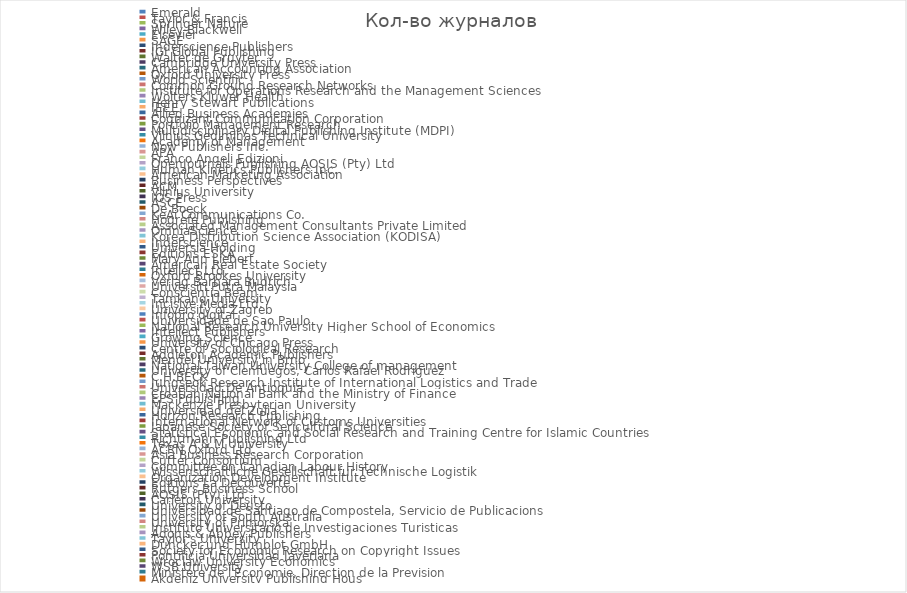
| Category | Кол-во журналов |
|---|---|
| Emerald | 183 |
| Taylor & Francis | 167 |
| Springer Nature | 107 |
| Wiley-Blackwell | 103 |
| Elsevier | 102 |
| SAGE | 93 |
| Inderscience Publishers | 92 |
| IGI Global Publishing | 22 |
| Walter de Gruyter | 22 |
| Cambridge University Press | 14 |
| American Accounting Association | 14 |
| Oxford University Press | 11 |
| World Scientific | 11 |
| Common Ground Research Networks | 7 |
| Institute for Operations Research and the Management Sciences | 7 |
| Wolters Kluwer Health | 6 |
| Henry Stewart Publications | 6 |
| IEEE | 5 |
| Allied Business Academies | 5 |
| Cognizant Communication Corporation | 5 |
| Portfolio Management Research | 4 |
| Multidisciplinary Digital Publishing Institute (MDPI) | 4 |
| Vilnius Gediminas Technical University | 4 |
| Academy of Management | 4 |
| Now Publishers Inc. | 4 |
| APA | 3 |
| Franco Angeli Edizioni | 3 |
| OpenJournals Publishing AOSIS (Pty) Ltd | 3 |
| Human Kinetics Publishers Inc. | 3 |
| American Marketing Association | 3 |
| Business Perspectives | 3 |
| ACM | 3 |
| Vilnius University | 3 |
| IOS Press | 3 |
| ASCE | 3 |
| De Boeck | 3 |
| KeAi Communications Co. | 3 |
| Hogrefe Publishing | 2 |
| Associated Management Consultants Private Limited | 2 |
| OmniaScience | 2 |
| Korea Distribution Science Association (KODISA) | 2 |
| Inderscience | 2 |
| Universia Holding | 2 |
| Editions ESKA | 2 |
| Mary Ann Liebert | 2 |
| American Real Estate Society | 2 |
| Intellect Ltd. | 2 |
| Oxford Brookes University | 2 |
| Verlag Barbara Budrich | 2 |
| Universiti Putra Malaysia | 2 |
| Conscientia Beam | 2 |
| Tamkang University | 2 |
| Incisive Media Ltd. | 2 |
| University of Zagreb | 2 |
| Infopro digital | 2 |
| Universidade de Sao Paulo | 2 |
| National Research University Higher School of Economics | 2 |
| Intellect Publishers | 2 |
| Growing Science | 2 |
| University of Chicago Press | 2 |
| Centre of Sociological Research | 2 |
| Addleton Academic Publishers | 2 |
| Mendel University in Brno | 1 |
| National Taiwan University College of management | 1 |
| University of Cienfuegos, Carlos Rafael Rodriguez | 1 |
| C.H.BECK | 1 |
| Jungseok Research Institute of International Logistics and Trade | 1 |
| Universidad De Antioquia | 1 |
| Croatian National Bank and the Ministry of Finance | 1 |
| EPS Publishing | 1 |
| Mackenzie Presbyterian University | 1 |
| Universidad del Zulia | 1 |
| Horizon Research Publishing | 1 |
| International Network of Customs Universities | 1 |
| Japanese Society of Sericultural Science | 1 |
| Statistical Economic and Social Research and Training Centre for Islamic Countries | 1 |
| Richtmann Publishing Ltd | 1 |
| Texas A & M University | 1 |
| ACRN Oxford Ltd. | 1 |
| Asia Business Research Corporation | 1 |
| Cutter Consortium | 1 |
| Committee on Canadian Labour History | 1 |
| Wissenschaftliche Gesellschaft fur Technische Logistik | 1 |
| Organization Development Institute | 1 |
| Editions La Decouverte | 1 |
| Rutgers Business School | 1 |
| AOSIS (Pty) Ltd | 1 |
| Carleton University | 1 |
| University of Deusto | 1 |
| Universidad de Santiago de Compostela, Servicio de Publicacions | 1 |
| University of South Australia | 1 |
| University of Primorska | 1 |
| Instituto Universitario de Investigaciones Turisticas | 1 |
| Adonis & Abbey Publishers | 1 |
| Taylor's University | 1 |
| Duncker und Humblot GmbH | 1 |
| Society for Economic Research on Copyright Issues | 1 |
| Pontificia Universidad Javeriana | 1 |
| Wroclaw University Economics | 1 |
| WSB University | 1 |
| Ministere de l'Economie, Direction de la Prevision | 1 |
| Akdeniz University Publishing Hous | 1 |
| Chulalognkorn University | 1 |
| US. Bureau of Labor Statistics | 1 |
| Asociatia de Psihologie Industriala si Organizationala | 1 |
| Australasian Tax Teachers' Association | 1 |
| University of Pardubice | 1 |
| The Association of Private Enterprise Education | 1 |
| Escuela Universitaria de Turismo, Universidad de Murcia | 1 |
| Restaurant Business | 1 |
| Middle East Forum | 1 |
| CERN Publishing | 1 |
| Academy of Taiwan Information Systems Research | 1 |
| Universidade Federal Rural de Pernambuco | 1 |
| FUCAPE Business School | 1 |
| UP Media Group, Inc. | 1 |
| Australian School of Business, University of New South Wales | 1 |
| INFORMS Institute for Operations Research and the Management Sciences | 1 |
| Department of Textile and Apparel, Technology and Management | 1 |
| Penerbit Universiti Teknikal Malaysia Melaka | 1 |
| Korean Society for Railway | 1 |
| Singapore University Press | 1 |
| Society for Alliance, Fidelity and Advancement | 1 |
| University of Tehran | 1 |
| Lavoisier | 1 |
| John Benjamins Publishing Company | 1 |
| Ministere du Travail et de la Participation | 1 |
| Research Institute for Man-Made Fibres | 1 |
| Canadian Network for Innovation in Education | 1 |
| Francophone Association of Accounting | 1 |
| Islamic Azad University | 1 |
| Metropolitan Publishing | 1 |
| Universidad de Oviedo | 1 |
| Asian Exercise and Sport Science Association | 1 |
| Textile Rental Services Association of America | 1 |
| Social Sciences Research Society | 1 |
| Masaryk University Faculty of Sports Studies | 1 |
| Universidad Icesi | 1 |
| Textile Association (India) | 1 |
| California State University Press | 1 |
| Japan Research Association for Textile End-User | 1 |
| University of Saskatchewan, Department of Educational Administration, College of Education | 1 |
| Advanstar Communications Inc. | 1 |
| Universidade Federal de Santa Catarina | 1 |
| Graziadio School of Business and Management-Pepperdine University | 1 |
| Universidad Nacional de La Plata | 1 |
| Gito Verlag | 1 |
| Food Distribution Research Society | 1 |
| River Publishers | 1 |
| Nihon Keikei Kogakkai | 1 |
| Financial University under The Government of Russian Federation | 1 |
| Duke University Press | 1 |
| National Taipei University of Technology | 1 |
| North University of China | 1 |
| School of Management Sciences | 1 |
| GDMB Informationsgesellschaft mbH | 1 |
| Warsaw University | 1 |
| Philosophy Documentation Center | 1 |
| Herald Academic Ltd | 1 |
| Indian Institute of Finance | 1 |
| The Society of Systematic Innovation | 1 |
| Global Social Science Institute | 1 |
| Journal of Australian Taxation Pty Ltd | 1 |
| University of Aveiro | 1 |
| Institute of Economic Sciences | 1 |
| Korean Accounting Association | 1 |
| Polska Akademia Nauk | 1 |
| SCMS Group of Educational Institutions | 1 |
| Textiles Intelligence Ltd. | 1 |
| Virtus Interpress | 1 |
| Presses Universitaires de Grenoble | 1 |
| Universitat de Barcelona, Facultad de Economia y Empresa | 1 |
| Universidad Politecnica de Valencia | 1 |
| Journal of Accounting Review | 1 |
| Association of Guilds of Weavers Spinners & Dyers | 1 |
| Ewha Womans University Graduate School of International Studies | 1 |
| Verlag Neue Wirtschafts-Briete GmbH & Co. | 1 |
| Sheshunoff Information Services Inc. | 1 |
| Engineering Project Organization Society (EPOS) | 1 |
| Thomson Reuters | 1 |
| ADAPT University Press | 1 |
| GEA College - Faculty of Entrepreneurship | 1 |
| Pablo de Olavide University | 1 |
| Wydawnictwo Naukowe Uniwersytetu Szczecinskiego | 1 |
| University of Kassel | 1 |
| Assumption University | 1 |
| Universidade Federal De Goias (UFG) | 1 |
| Prague University of Economics and Business | 1 |
| Information Institute | 1 |
| VGTU: Vilniaus Gedimino technikos universitetas | 1 |
| Wroclaw University of Science and Technology | 1 |
| Edinburgh University Press | 1 |
| Documentation Francaise | 1 |
| F. Cass | 1 |
| COMADEM International | 1 |
| Massey University | 1 |
| Publishing India Group | 1 |
| Iran University of Science and Technology | 1 |
| National Academy of Sciences of Ukraine | 1 |
| IAE School of Management Montpellier University | 1 |
| eum - Edizioni Universita di Macerata | 1 |
| Liverpool University Press | 1 |
| Taiwan Association of Engineering and Technology Innovation | 1 |
| Futuribles International | 1 |
| Boom Lemma uitgevers | 1 |
| Slovenian Academy of Management | 1 |
| Harvard International Relations Council | 1 |
| International Association of Assessing Officers | 1 |
| SRA International | 1 |
| American Society for Quality Control | 1 |
| Universidad de Valladolid | 1 |
| Institute of Agricultural Management | 1 |
| Pro Global Science Association | 1 |
| Universidade Nove de Julho-UNINOVE | 1 |
| Waxmann Verlag GMBH | 1 |
| Editions Classiques Garnier | 1 |
| Publishing House Akademperiodyka | 1 |
| University of Kragujevac - Faculty of Economics | 1 |
| Universidad Nacional de Colombia | 1 |
| Marketing Management Association | 1 |
| De la Salle University | 1 |
| Higher Education Press | 1 |
| Institute for Tourism & Croatian Tourist Board | 1 |
| CENTMA Research | 1 |
| Institute of Economics, The Ural Branch of Russian Academy of Sciences | 1 |
| Cogent OA | 1 |
| Technical University of Kosice | 1 |
| ASERS Publishing House | 1 |
| Faculty of Engineering Universitas Indonesia | 1 |
| N T C Publications Ltd. | 1 |
| International University College | 1 |
| Anadolu University, Faculty of Communication Sciences | 1 |
| Montenegrin Sports Academy | 1 |
| ICE Publishing Ltd. | 1 |
| The Information Resources Management Association (IRMA) | 1 |
| PC Technology Center | 1 |
| Cracow University of Economics | 1 |
| Kaunas University of Technology | 1 |
| Technical University Liberec | 1 |
| Association for Computing Machinery (ACM) | 1 |
| University of Novi Sad | 1 |
| Fitness Information Technology | 1 |
| International Strategic Management Association | 1 |
| SRAC - Societatea Romana Pentru Asigurarea Calitatii | 1 |
| L & H Scientific Publishing, LLC | 1 |
| Sichuan Institute of Piezoelectric and Acoustooptic Technology | 1 |
| International Journal of Mathematical, Engineering and Management Sciences (IJMEMS) | 1 |
| Gadjah Mada University | 1 |
| Regional Science Association of Subotica (Drustvo za Regionalne Nauke) | 1 |
| University of Belgrade | 1 |
| Midwest Public Affairs Conference | 1 |
| Northwestern University School of Law | 1 |
| American Institute of Mathematical Sciences | 1 |
| American Institute of Aeronautics and Astronautics | 1 |
| Federal Reserve Bank of St. Louis | 1 |
| The Technical University of Lodz | 1 |
| Asian Economic and Social Society | 1 |
| Penerbit Universiti Sains Malaysia | 1 |
| Editura Economica | 1 |
| Now Publishers Inc | 1 |
| University of Rijeka, Faculty of Tourism and Hospitality Management, Opatija | 1 |
| University of Novi Sad, Faculty of Technical Sciences | 1 |
| International Food and Agribusiness Management Association | 1 |
| University of Economics and Human Sciences in Warsaw | 1 |
| The Advertising Research Foundation | 1 |
| Czestochowa University of Technology | 1 |
| Middle Tennessee State University | 1 |
| Scika | 1 |
| United Nations Publications | 1 |
| Engage Healthcare Communications, LLC | 1 |
| Massachusetts Institute of Technology | 1 |
| National Cheng Kung University | 1 |
| Production Engineering Institute (PEI), University of Maribor | 1 |
| Instytut Badań Gospodarczych/Institute of Economic Research (Poland) | 1 |
| University of Wisconsin Press | 1 |
| Cornell University Press | 1 |
| George Washington University | 1 |
| European Academy of Management and Business Economics | 1 |
| University of California Press | 1 |
| University of Minnesota | 1 |
| Brookings Institution Press | 1 |
| National Taiwan University of Science and Technology | 1 |
| American Society for Quality | 1 |
| Tongji University Press | 1 |
| FiT Publishing | 1 |
| Polish Academy of Sciences | 1 |
| Tomas Bata University in Zlin | 1 |
| UQ Business School, The University of Queensland | 1 |
| UTS ePress | 1 |
| Rutgers University | 1 |
| Harvard Business School Publishing | 1 |
| University of Wollongong | 1 |
| Dove Medical Press | 1 |
| Hindawi | 1 |
| Colegio Oficial de Psicólogos de Madrid | 1 |
| Societa Italiana di Estimo e Valutazione (SIEV) | 1 |
| Ashwin Anokha Publications and Distributors | 1 |
| Ore & Metals Publishing House | 1 |
| Fakulteta za Organizacijske Vede, Univerza v Mariboru | 1 |
| University of Hong Kong | 1 |
| Association for Investment Management and Research | 1 |
| Academic Conferences and Publishing International | 1 |
| Roskilde University | 1 |
| University of Bahrain | 1 |
| University of Malaya | 1 |
| Dublin Institute of Technology | 1 |
| Premier Publishing | 1 |
| Sanseido Publishing Company, Ltd. | 1 |
| Universidad de Huelva | 1 |
| BMJ Publishing Group | 1 |
| Nomos Verlagsgesellschaft mbH and Co. KG | 1 |
| Alexandru Ioan Cuza - University of Iasi | 1 |
| Economia Civile | 1 |
| Poznan School of Logistics | 1 |
| Telecommunications Association Inc. | 1 |
| Mundo Press | 1 |
| Journal of Technology Management & Innovation Group | 1 |
| Fundacao Getulio Vargas, Escola de Administracao de Empresas de Sao Paulo | 1 |
| Brunel University | 1 |
| Africa Journals | 1 |
| National Conference of Bankruptcy Judges | 1 |
| Brazilian Administration Review | 1 |
| Annual Reviews Inc. | 1 |
| Regional Information Center for Science and Technology | 1 |
| Johar Education Society Pakistan | 1 |
| International Forum of Management Scholars (INFOMS) | 1 |
| Institute of Eastern Europe and Central Asia | 1 |
| American Library Association | 1 |
| Transnational Press London Ltd. | 1 |
| CEPADE-Universidad Politecnica de Madrid | 1 |
| Universidade Federal de Sao Carlos | 1 |
| USC Annenberg School for Communication & Journalism | 1 |
| Success Culture Press | 1 |
| Brill | 1 |
| Akademiai Kiado | 1 |
| Presses Universitaires de France | 1 |
| WSEAS Press | 1 |
| University of Split - Faculty of Economics | 1 |
| 4S go, s.r.o | 1 |
| Asian Academy of Management and Universiti Sains Malasia | 1 |
| American Bar Association | 1 |
| Logos Verlag Berlin GmbH | 1 |
| Western Academic Publishers | 1 |
| Universidad Complutense de Madrid | 1 |
| Academic Publishing Limited | 1 |
| Research Development National Institute for Textile and Leather | 1 |
| Centro de Informacion Tecnologica | 1 |
| Operations and Supply Chain Management Forum | 1 |
| Nomos Verlagsgesellschaft mbH und Co | 1 |
| Universiti Sains Malaysia | 1 |
| Mykolo Romerio Universitetas | 1 |
| Universidad Nacional Autonoma de Mexico | 1 |
| Faculty of Business and Accountancy, University of Malaya | 1 |
| Urednistvo Casopisa | 1 |
| Birlesik Dunya Yenilik Arastirma ve Yayıncilik Merkezi | 1 |
| Babes-Bolyai University | 1 |
| DMSP Research Center, Paris-Dauphine University | 1 |
| Deakin University | 1 |
| National Recreation and Park Association | 1 |
| People and Global Business Association | 1 |
| Lukasiewicz Research Network - Institute of Biopolymers and Chemical Fibres | 1 |
| Universidad del Pais Vasco | 1 |
| University of SS. Cyril and Methodius, Faculty of Mass Media Communication | 1 |
| School of Economics and Business in Sarajevo | 1 |
| Budapesti Muszaki es Gazdasagtudomanyi Egyetem/Budapest University of Technology and Economics | 1 |
| Fundacao Escola de Comercio Alvares Penteado (FECAP) | 1 |
| AOSIS (pty) Ltd | 1 |
| Universiti Malaysia Sarawak | 1 |
| Karger | 1 |
| UIKTEN - Association for Information Communication Technology Education and Science | 1 |
| McKinsey & Co. | 1 |
| Bundesvereinigung Logistik (BVL) | 1 |
| Universiti Kebangsaan Malaysia | 1 |
| Kharazmi University | 1 |
| Machine Intelligence Research Labs | 1 |
| Ecole des Hautes Etudes Commerciales | 1 |
| Pluto Journals | 1 |
| LLC CPC Business Perspectives | 1 |
| Societa Editrice Il Mulino | 1 |
| IBIMA Publishing | 1 |
| Datakonekt sro | 1 |
| Sciendo | 1 |
| Faculty of Business Administration, University of Economics | 1 |
| National Research University, Higher School of Econoimics | 1 |
| Business News Publishing Co. | 1 |